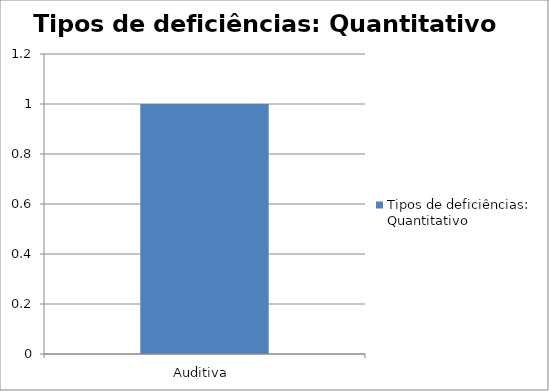
| Category | Tipos de deficiências: Quantitativo |
|---|---|
| Auditiva  | 1 |